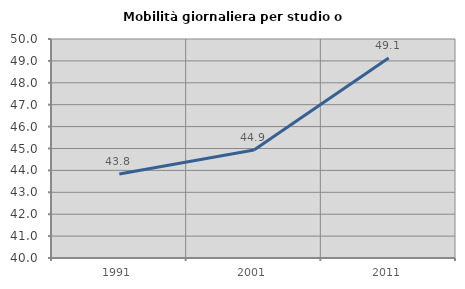
| Category | Mobilità giornaliera per studio o lavoro |
|---|---|
| 1991.0 | 43.837 |
| 2001.0 | 44.934 |
| 2011.0 | 49.132 |